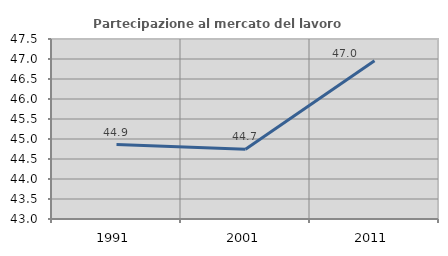
| Category | Partecipazione al mercato del lavoro  femminile |
|---|---|
| 1991.0 | 44.862 |
| 2001.0 | 44.746 |
| 2011.0 | 46.955 |